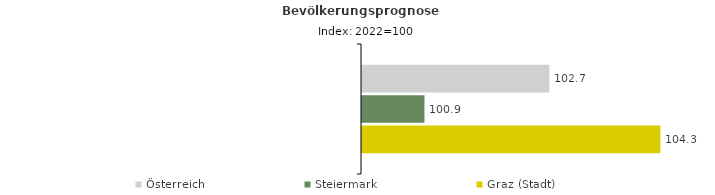
| Category | Österreich | Steiermark | Graz (Stadt) |
|---|---|---|---|
| 2022.0 | 102.7 | 100.9 | 104.3 |